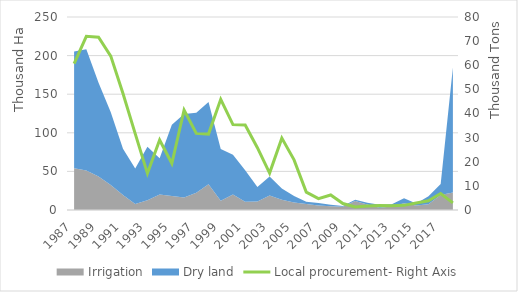
| Category | Local procurement- Right Axis |
|---|---|
| 1987.0 | 60.65 |
| 1988.0 | 71.999 |
| 1989.0 | 71.633 |
| 1990.0 | 63.784 |
| 1991.0 | 48.278 |
| 1992.0 | 31.633 |
| 1993.0 | 15.193 |
| 1994.0 | 29.031 |
| 1995.0 | 19.261 |
| 1996.0 | 41.464 |
| 1997.0 | 31.762 |
| 1998.0 | 31.463 |
| 1999.0 | 45.871 |
| 2000.0 | 35.393 |
| 2001.0 | 35.198 |
| 2002.0 | 25.835 |
| 2003.0 | 15.306 |
| 2004.0 | 29.787 |
| 2005.0 | 20.776 |
| 2006.0 | 7.403 |
| 2007.0 | 4.714 |
| 2008.0 | 6.233 |
| 2009.0 | 2.668 |
| 2010.0 | 1.221 |
| 2011.0 | 1.641 |
| 2012.0 | 1.891 |
| 2013.0 | 1.764 |
| 2014.0 | 1.923 |
| 2015.0 | 2.926 |
| 2016.0 | 3.843 |
| 2017.0 | 6.827 |
| 2018.0 | 2.965 |